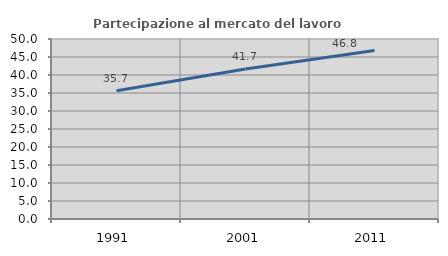
| Category | Partecipazione al mercato del lavoro  femminile |
|---|---|
| 1991.0 | 35.654 |
| 2001.0 | 41.679 |
| 2011.0 | 46.776 |